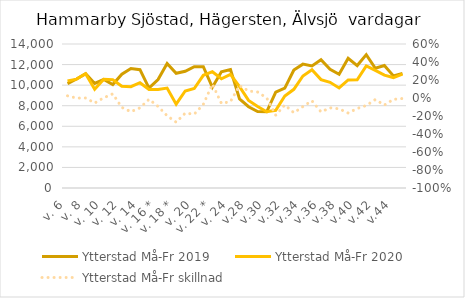
| Category | Ytterstad |
|---|---|
| v. 6 | 10399 |
| v. 7 | 10587 |
| v. 8 | 11109 |
| v. 9 | 9595 |
| v. 10 | 10569 |
| v. 11 | 10525 |
| v. 12 | 9901 |
| v. 13 | 9853 |
| v. 14 | 10237 |
| v. 15 * | 9571 |
| v. 16 * | 9570 |
| v. 17 | 9712.885 |
| v. 18 * | 8155.348 |
| v. 19 | 9433.088 |
| v. 20 | 9674.45 |
| v. 21 * | 10953.42 |
| v. 22 * | 11306.837 |
| v. 23 | 10616.574 |
| v. 24 | 11049.68 |
| v.27 | 9858.463 |
| v.28 | 8515.246 |
| v.29 | 7925.979 |
| v.30 | 7412.294 |
| v.31 | 7554.031 |
| v.32 | 8950.564 |
| v.33 | 9592.67 |
| v.34 | 10890.834 |
| v.35 | 11500.256 |
| v.36 | 10535.513 |
| v.37 | 10272.514 |
| v.38 | 9727.353 |
| v.39 | 10505.409 |
| v.40 | 10515.091 |
| v.41 | 11878.472 |
| v.42 | 11439.628 |
| v.43 | 10972.152 |
| v.44 | 10737.307 |
| v.45 | 11068.731 |